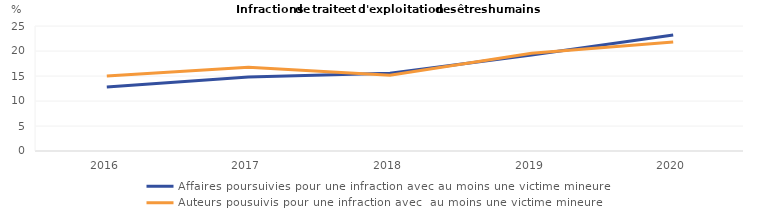
| Category | Affaires poursuivies pour une infraction avec au moins une victime mineure | Auteurs pousuivis pour une infraction avec  au moins une victime mineure |
|---|---|---|
| 2016.0 | 12.821 | 15.013 |
| 2017.0 | 14.821 | 16.728 |
| 2018.0 | 15.53 | 15.162 |
| 2019.0 | 19.211 | 19.553 |
| 2020.0 | 23.2 | 21.812 |